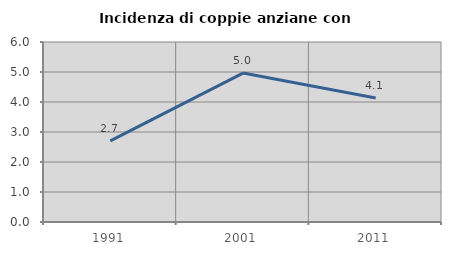
| Category | Incidenza di coppie anziane con figli |
|---|---|
| 1991.0 | 2.703 |
| 2001.0 | 4.965 |
| 2011.0 | 4.132 |